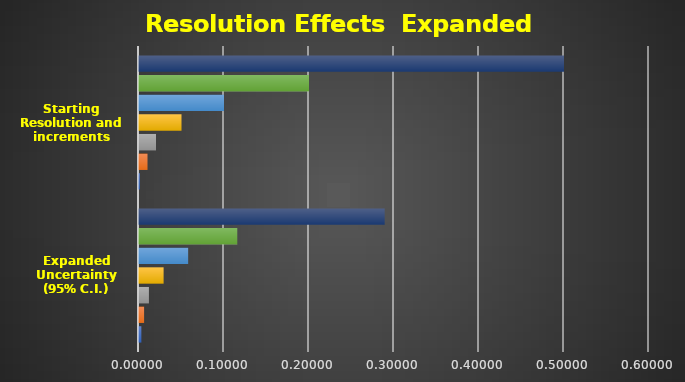
| Category | Series 0 | Series 1 | Series 2 | Series 3 | Series 4 | Series 5 | Series 6 |
|---|---|---|---|---|---|---|---|
| Expanded Uncertainty (95% C.I.) | 0.003 | 0.006 | 0.012 | 0.029 | 0.058 | 0.116 | 0.289 |
| Starting Resolution and increments | 0.001 | 0.01 | 0.02 | 0.05 | 0.1 | 0.2 | 0.5 |